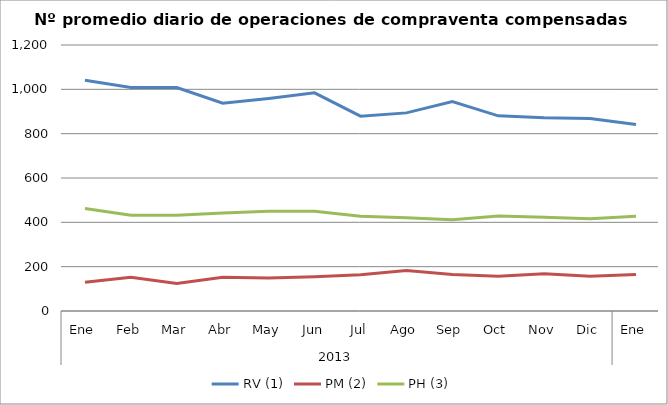
| Category | RV (1) | PM (2) | PH (3) |
|---|---|---|---|
| 0 | 1040.636 | 129.682 | 462.545 |
| 1 | 1008.7 | 152.35 | 432.05 |
| 2 | 1008.45 | 123.6 | 431.9 |
| 3 | 937.091 | 152.273 | 442.545 |
| 4 | 958.381 | 148.429 | 449.571 |
| 5 | 984.3 | 154.95 | 450 |
| 6 | 878.955 | 163.091 | 427.955 |
| 7 | 893.762 | 182.333 | 420.857 |
| 8 | 945.278 | 164.944 | 411.222 |
| 9 | 880.5 | 156.955 | 428.864 |
| 10 | 871.35 | 167.95 | 423.25 |
| 11 | 868.85 | 156.75 | 415.75 |
| 12 | 841.591 | 164.955 | 427.091 |